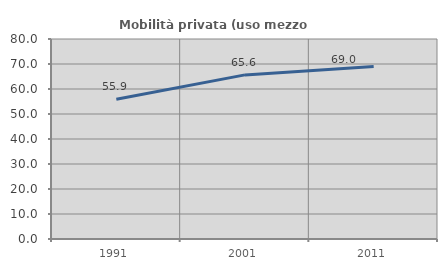
| Category | Mobilità privata (uso mezzo privato) |
|---|---|
| 1991.0 | 55.895 |
| 2001.0 | 65.641 |
| 2011.0 | 68.978 |